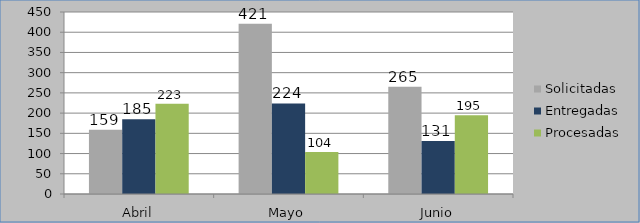
| Category | Solicitadas | Entregadas | Procesadas |
|---|---|---|---|
| Abril | 159 | 185 | 223 |
| Mayo | 421 | 224 | 104 |
| Junio | 265 | 131 | 195 |